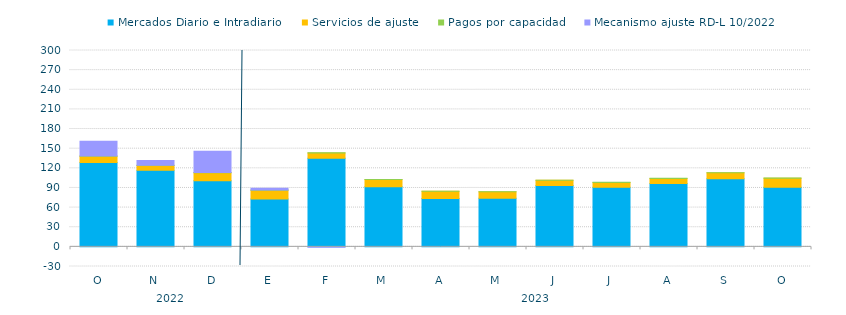
| Category | Mercados Diario e Intradiario  | Servicios de ajuste | Pagos por capacidad | Mecanismo ajuste RD-L 10/2022 |
|---|---|---|---|---|
| O | 128.7 | 9.92 | 0.21 | 22.46 |
| N | 117.14 | 7.3 | 0.31 | 7.12 |
| D | 101.17 | 12.19 | 0.43 | 32.16 |
| E | 73.09 | 13.3 | 0.34 | 2.9 |
| F | 135.42 | 7.84 | 0.35 | -0.72 |
| M | 91.9 | 10.87 | 0.24 | 0 |
| A | 74.07 | 10.71 | 0.16 | 0 |
| M | 74.23 | 9.96 | 0.17 | 0 |
| J | 93.62 | 8.14 | 0.19 | 0 |
| J | 90.89 | 7.42 | 0.33 | 0 |
| A | 96.82 | 7.66 | 0.2 | 0 |
| S | 104.16 | 8.9 | 0.18 | 0 |
| O | 90.93 | 14.01 | 0.16 | 0 |